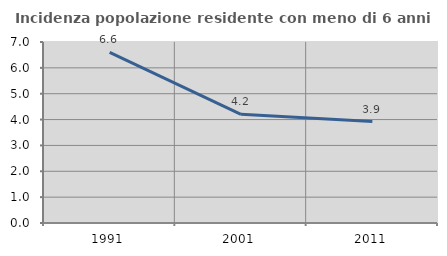
| Category | Incidenza popolazione residente con meno di 6 anni |
|---|---|
| 1991.0 | 6.596 |
| 2001.0 | 4.203 |
| 2011.0 | 3.922 |